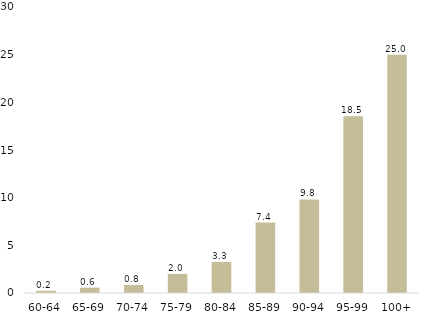
| Category | Series 0 |
|---|---|
| 60-64 | 0.234 |
| 65-69 | 0.563 |
| 70-74 | 0.847 |
| 75-79 | 2.005 |
| 80-84 | 3.257 |
| 85-89 | 7.391 |
| 90-94 | 9.812 |
| 95-99 | 18.545 |
| 100+ | 25 |